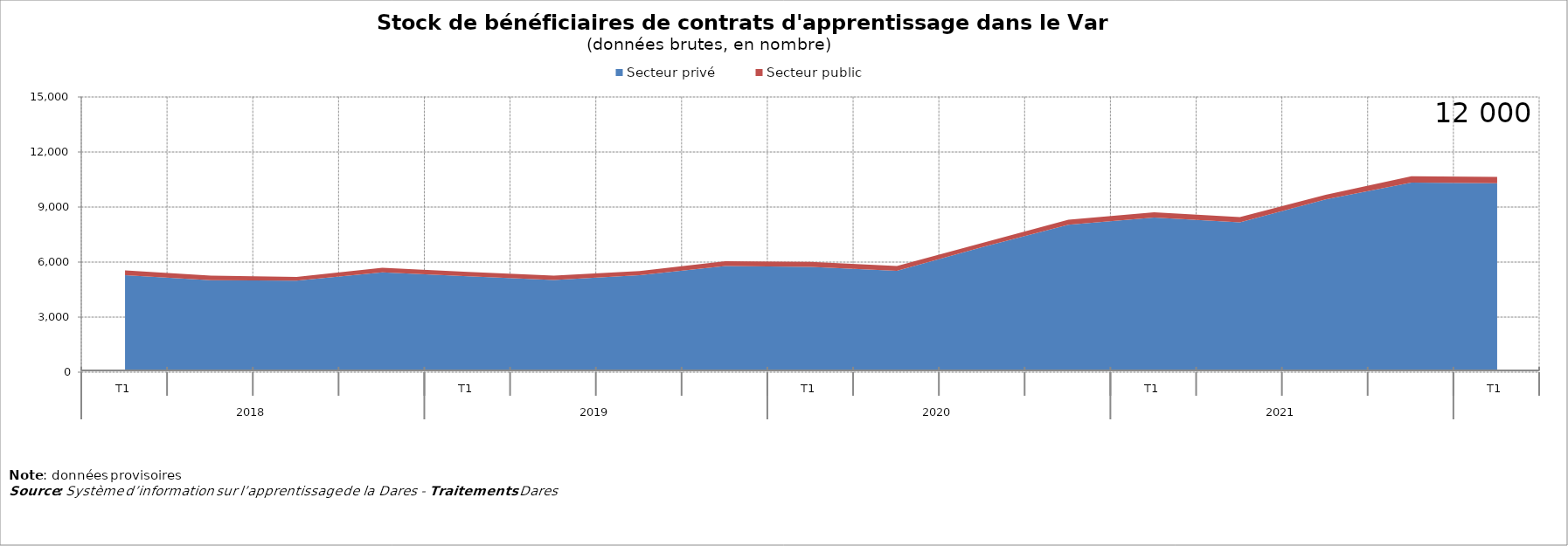
| Category | Secteur privé | Secteur public |
|---|---|---|
| 0 | 5291 | 257 |
| 1 | 5013 | 249 |
| 2 | 4986 | 203 |
| 3 | 5440 | 250 |
| 4 | 5224 | 242 |
| 5 | 5027 | 240 |
| 6 | 5283 | 229 |
| 7 | 5782 | 267 |
| 8 | 5743 | 264 |
| 9 | 5527 | 260 |
| 10 | 6827 | 226 |
| 11 | 8030 | 284 |
| 12 | 8425 | 293 |
| 13 | 8164 | 286 |
| 14 | 9414 | 252 |
| 15 | 10337 | 345 |
| 16 | 10298 | 347 |